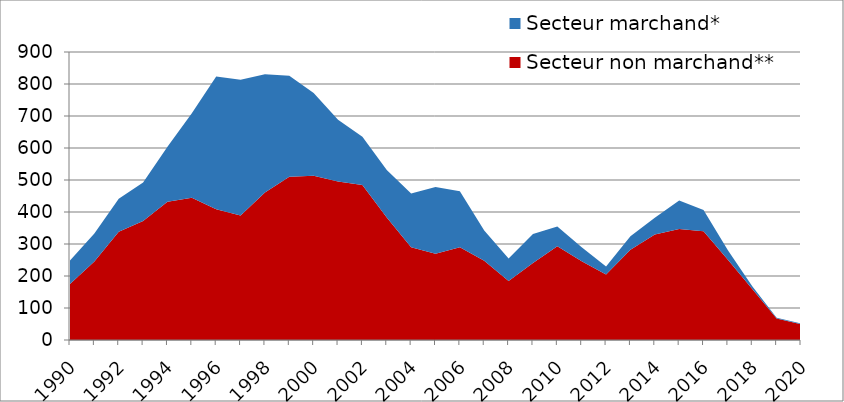
| Category | Secteur non marchand** | Secteur marchand* |
|---|---|---|
| 1990.0 | 175.062 | 73.254 |
| 1991.0 | 245.557 | 87.591 |
| 1992.0 | 338.39 | 102.669 |
| 1993.0 | 372.038 | 120.27 |
| 1994.0 | 431.828 | 171.813 |
| 1995.0 | 444.364 | 264.609 |
| 1996.0 | 408.686 | 414.632 |
| 1997.0 | 389.058 | 424.22 |
| 1998.0 | 460.602 | 369.993 |
| 1999.0 | 510.326 | 315.082 |
| 2000.0 | 513.179 | 258.618 |
| 2001.0 | 495.373 | 193.06 |
| 2002.0 | 484.697 | 150.771 |
| 2003.0 | 382.75 | 148.794 |
| 2004.0 | 289.857 | 167.982 |
| 2005.0 | 269.555 | 208.88 |
| 2006.0 | 289.53 | 174.983 |
| 2007.0 | 247.713 | 94.224 |
| 2008.0 | 184.436 | 69.914 |
| 2009.0 | 240.871 | 90.654 |
| 2010.0 | 292.661 | 62.382 |
| 2011.0 | 246.216 | 43.5 |
| 2012.0 | 204.435 | 25.641 |
| 2013.0 | 281.695 | 42.35 |
| 2014.0 | 329.766 | 52.103 |
| 2015.0 | 346.554 | 89.722 |
| 2016.0 | 340.083 | 65.922 |
| 2017.0 | 250.617 | 29.909 |
| 2018.0 | 159.176 | 9.147 |
| 2019.0 | 67.165 | 2.286 |
| 2020.0 | 49.134 | 2.675 |